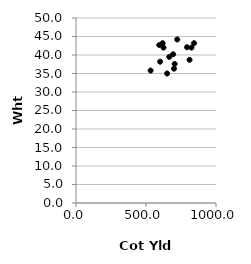
| Category | Series 0 |
|---|---|
| 601.0 | 38.2 |
| 705.0 | 37.6 |
| 533.0 | 35.8 |
| 700.0 | 36.3 |
| 666.0 | 39.5 |
| 619.0 | 43.2 |
| 595.0 | 42.7 |
| 625.0 | 42 |
| 694.0 | 40.2 |
| 651.0 | 35 |
| 723.0 | 44.2 |
| 843.0 | 43.2 |
| 825.0 | 42 |
| 811.0 | 38.7 |
| 793.0 | 42.1 |